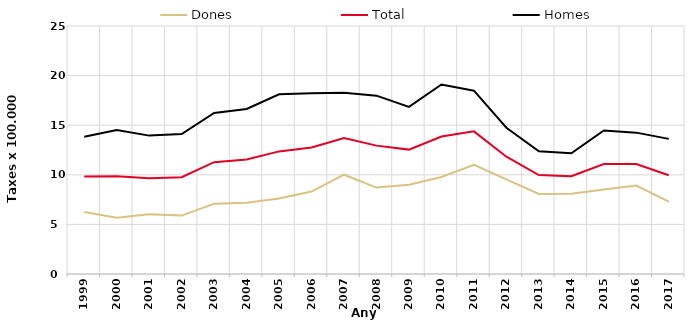
| Category | Dones | Total | Homes |
|---|---|---|---|
| 1999.0 | 6.26 | 9.84 | 13.83 |
| 2000.0 | 5.67 | 9.85 | 14.51 |
| 2001.0 | 6.02 | 9.66 | 13.95 |
| 2002.0 | 5.89 | 9.76 | 14.11 |
| 2003.0 | 7.07 | 11.27 | 16.24 |
| 2004.0 | 7.19 | 11.55 | 16.64 |
| 2005.0 | 7.61 | 12.36 | 18.11 |
| 2006.0 | 8.31 | 12.75 | 18.21 |
| 2007.0 | 10.01 | 13.7 | 18.26 |
| 2008.0 | 8.71 | 12.94 | 17.98 |
| 2009.0 | 8.99 | 12.54 | 16.85 |
| 2010.0 | 9.78 | 13.86 | 19.1 |
| 2011.0 | 11 | 14.38 | 18.48 |
| 2012.0 | 9.53 | 11.82 | 14.74 |
| 2013.0 | 8.07 | 9.98 | 12.38 |
| 2014.0 | 8.09 | 9.85 | 12.17 |
| 2015.0 | 8.51 | 11.09 | 14.47 |
| 2016.0 | 8.92 | 11.09 | 14.25 |
| 2017.0 | 7.29 | 9.95 | 13.62 |